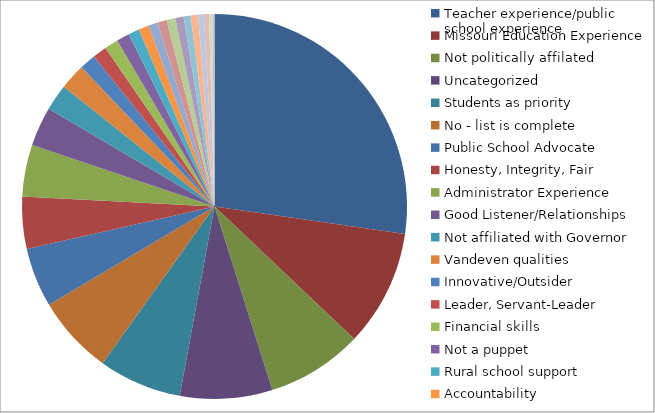
| Category | Series 0 | Series 1 |
|---|---|---|
| Teacher experience/public school experience | 0.328 | 778 |
| Missouri Education Experience   | 0.118 | 279 |
| Not politically affilated  | 0.097 | 230 |
| Uncategorized  | 0.093 | 221 |
| Students as priority   | 0.084 | 199 |
| No - list is complete  | 0.079 | 188 |
| Public School Advocate   | 0.06 | 142 |
| Honesty, Integrity, Fair   | 0.053 | 125 |
| Administrator Experience    | 0.052 | 124 |
| Good Listener/Relationships | 0.04 | 94 |
| Not affiliated with Governor | 0.027 | 63 |
| Vandeven qualities | 0.026 | 62 |
| Innovative/Outsider   | 0.016 | 39 |
| Leader, Servant-Leader   | 0.014 | 34 |
| Financial skills   | 0.014 | 33 |
| Not a puppet   | 0.013 | 31 |
| Rural school support   | 0.011 | 26 |
| Accountability     | 0.01 | 25 |
| Compassionate,Empathy   | 0.009 | 22 |
| Team Builder/Player  | 0.009 | 22 |
| Special Education Experience  | 0.009 | 21 |
| Visionary | 0.008 | 20 |
| Doctorate  | 0.007 | 17 |
| Open-Minded   | 0.007 | 17 |
| Keep local control  | 0.006 | 14 |
| Common Sense   | 0.005 | 12 |
| No doctorate   | 0.003 | 8 |
| Not union affiliated  | 0.002 | 5 |